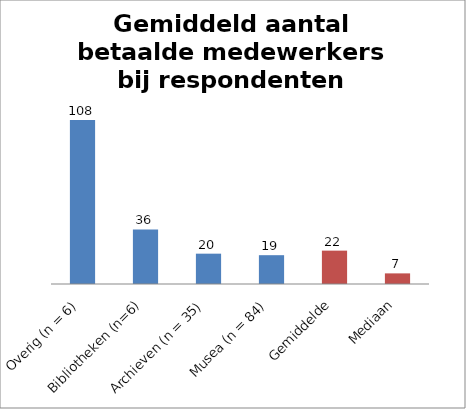
| Category | Series 0 |
|---|---|
| Overig (n = 6) | 108.2 |
| Bibliotheken (n=6) | 36 |
| Archieven (n = 35) | 20 |
| Musea (n = 84) | 19 |
| Gemiddelde | 22 |
| Mediaan | 7 |